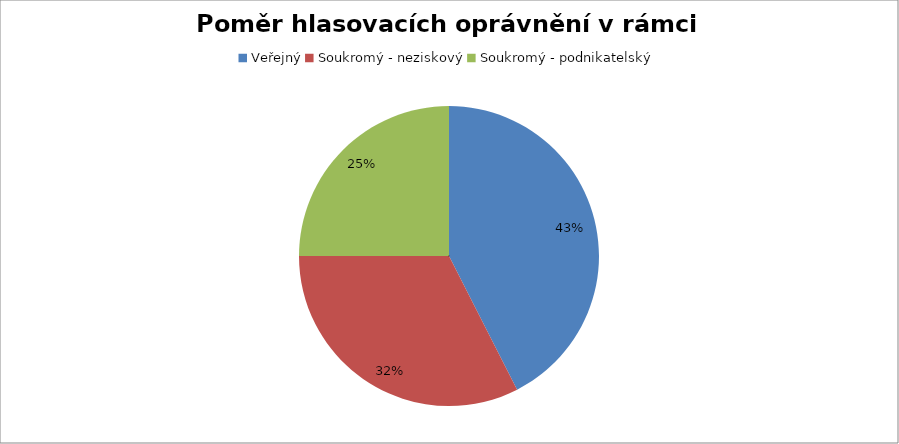
| Category | Series 0 |
|---|---|
| Veřejný | 0.425 |
| Soukromý - neziskový | 0.325 |
| Soukromý - podnikatelský | 0.25 |